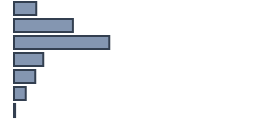
| Category | Percentatge |
|---|---|
| 0 | 9.318 |
| 1 | 24.545 |
| 2 | 39.697 |
| 3 | 12.197 |
| 4 | 8.864 |
| 5 | 4.924 |
| 6 | 0.455 |